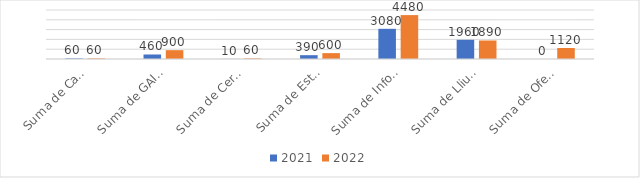
| Category | 2021 | 2022 |
|---|---|---|
| Suma de Campanyaweb | 60 | 60 |
| Suma de GAIPPT | 460 | 900 |
| Suma de Certificatreutilitzacio | 10 | 60 |
| Suma de EstadisticaSAIP | 390 | 600 |
| Suma de InfoTramitExhaustiva | 3080 | 4480 |
| Suma de LliuInferior | 1960 | 1890 |
| Suma de OfertaAssistenciaAssessorament | 0 | 1120 |